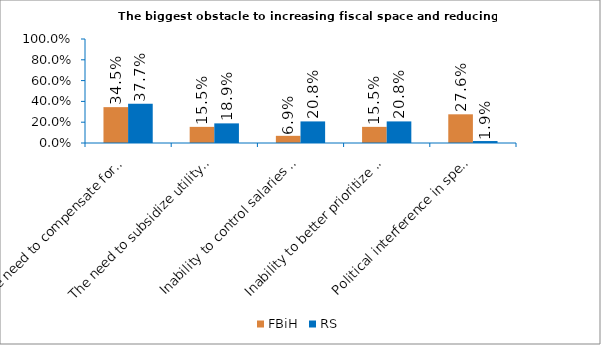
| Category | FBiH | RS |
|---|---|---|
| The need to compensate for unfulfilled responsibilities of higher levels of government | 0.345 | 0.377 |
| The need to subsidize utility and public companies | 0.155 | 0.189 |
| Inability to control salaries and employment in the public sector  | 0.069 | 0.208 |
| Inability to better prioritize projects due to the unreliability of grants | 0.155 | 0.208 |
| Political interference in spending decisions | 0.276 | 0.019 |